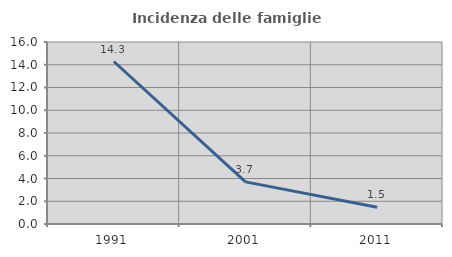
| Category | Incidenza delle famiglie numerose |
|---|---|
| 1991.0 | 14.286 |
| 2001.0 | 3.704 |
| 2011.0 | 1.471 |